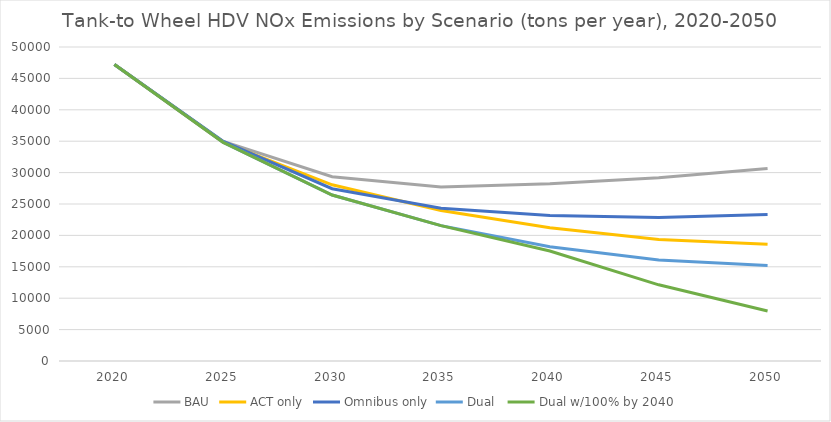
| Category | BAU | ACT only | Omnibus only | Dual  | Dual w/100% by 2040 |
|---|---|---|---|---|---|
| 2020.0 | 47219.869 | 47219.869 | 47219.869 | 47219.869 | 47219.869 |
| 2025.0 | 34959.456 | 34819.723 | 34959.456 | 34819.723 | 34819.723 |
| 2030.0 | 29332.145 | 28057.044 | 27436.878 | 26430.685 | 26430.685 |
| 2035.0 | 27720.451 | 23953.481 | 24332.052 | 21558.14 | 21558.14 |
| 2040.0 | 28241.911 | 21229.793 | 23151.203 | 18204.825 | 17518.747 |
| 2045.0 | 29187.392 | 19334.958 | 22856.811 | 16100.439 | 12130.213 |
| 2050.0 | 30661.89 | 18598.448 | 23328.015 | 15210.574 | 7952.476 |